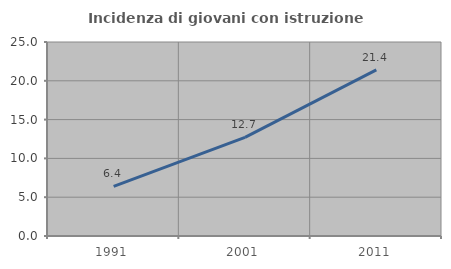
| Category | Incidenza di giovani con istruzione universitaria |
|---|---|
| 1991.0 | 6.407 |
| 2001.0 | 12.718 |
| 2011.0 | 21.408 |